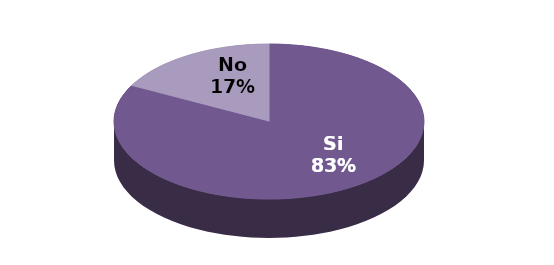
| Category | Series 1 |
|---|---|
| Si | 38 |
| No | 8 |